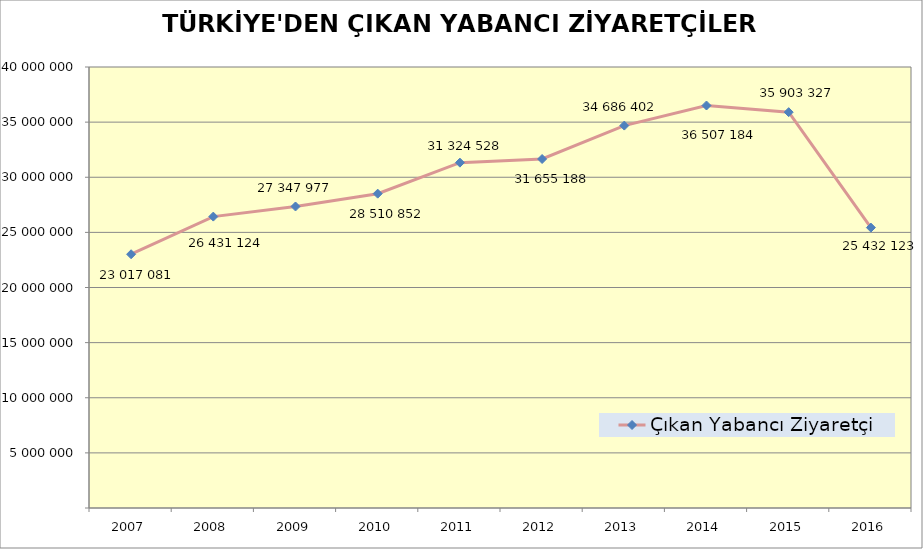
| Category | Çıkan Yabancı Ziyaretçi |
|---|---|
| 2007 | 23017081 |
| 2008 | 26431124 |
| 2009 | 27347977 |
| 2010 | 28510852 |
| 2011 | 31324528 |
| 2012 | 31655188 |
| 2013 | 34686402 |
| 2014 | 36507184 |
| 2015 | 35903327 |
| 2016 | 25432123 |